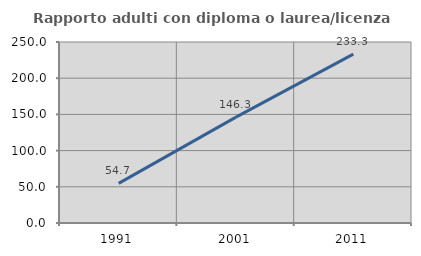
| Category | Rapporto adulti con diploma o laurea/licenza media  |
|---|---|
| 1991.0 | 54.671 |
| 2001.0 | 146.263 |
| 2011.0 | 233.333 |